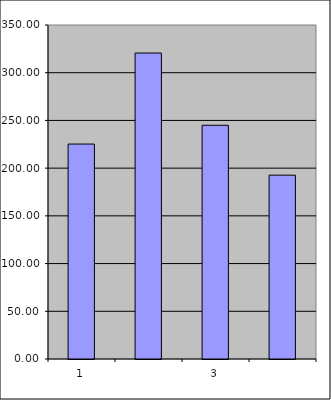
| Category | Series 0 |
|---|---|
| 0 | 225.25 |
| 1 | 320.631 |
| 2 | 244.945 |
| 3 | 192.65 |